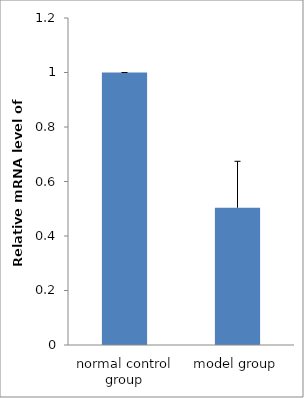
| Category | Series 0 |
|---|---|
| normal control group | 1 |
| model group | 0.504 |